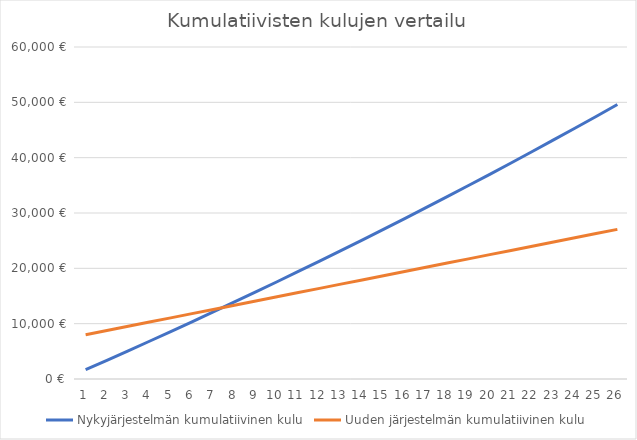
| Category | Nykyjärjestelmän kumulatiivinen kulu | Uuden järjestelmän kumulatiivinen kulu |
|---|---|---|
| 0 | 1680 | 8005 |
| 1 | 3376.8 | 8766.6 |
| 2 | 5090.568 | 9528.2 |
| 3 | 6821.474 | 10289.8 |
| 4 | 8569.688 | 11051.4 |
| 5 | 10335.385 | 11813 |
| 6 | 12118.739 | 12574.6 |
| 7 | 13919.927 | 13336.2 |
| 8 | 15739.126 | 14097.8 |
| 9 | 17576.517 | 14859.4 |
| 10 | 19432.282 | 15621 |
| 11 | 21306.605 | 16382.6 |
| 12 | 23199.671 | 17144.2 |
| 13 | 25111.668 | 17905.8 |
| 14 | 27042.785 | 18667.4 |
| 15 | 28993.212 | 19429 |
| 16 | 30963.144 | 20190.6 |
| 17 | 32952.776 | 20952.2 |
| 18 | 34962.304 | 21713.8 |
| 19 | 36991.927 | 22475.4 |
| 20 | 39041.846 | 23237 |
| 21 | 41112.264 | 23998.6 |
| 22 | 43203.387 | 24760.2 |
| 23 | 45315.421 | 25521.8 |
| 24 | 47448.575 | 26283.4 |
| 25 | 49603.061 | 27045 |